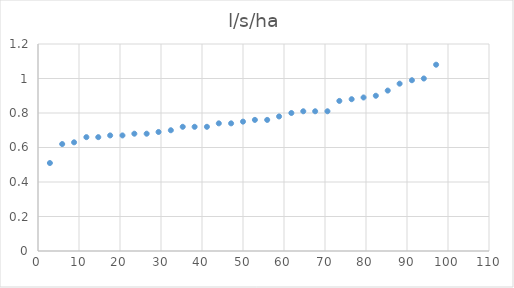
| Category | Series 0 |
|---|---|
| 2.9 | 0.51 |
| 5.9 | 0.62 |
| 8.8 | 0.63 |
| 11.8 | 0.66 |
| 14.7 | 0.66 |
| 17.6 | 0.67 |
| 20.6 | 0.67 |
| 23.5 | 0.68 |
| 26.5 | 0.68 |
| 29.4 | 0.69 |
| 32.4 | 0.7 |
| 35.3 | 0.72 |
| 38.2 | 0.72 |
| 41.2 | 0.72 |
| 44.1 | 0.74 |
| 47.1 | 0.74 |
| 50.0 | 0.75 |
| 52.9 | 0.76 |
| 55.9 | 0.76 |
| 58.8 | 0.78 |
| 61.8 | 0.8 |
| 64.7 | 0.81 |
| 67.6 | 0.81 |
| 70.6 | 0.81 |
| 73.5 | 0.87 |
| 76.5 | 0.88 |
| 79.4 | 0.89 |
| 82.4 | 0.9 |
| 85.3 | 0.93 |
| 88.2 | 0.97 |
| 91.2 | 0.99 |
| 94.1 | 1 |
| 97.1 | 1.08 |